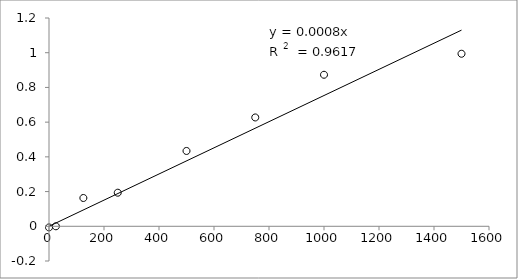
| Category | Series 0 |
|---|---|
| 1500.0 | 0.994 |
| 1000.0 | 0.873 |
| 750.0 | 0.627 |
| 500.0 | 0.434 |
| 250.0 | 0.194 |
| 125.0 | 0.163 |
| 25.0 | 0 |
| 0.0 | -0.007 |